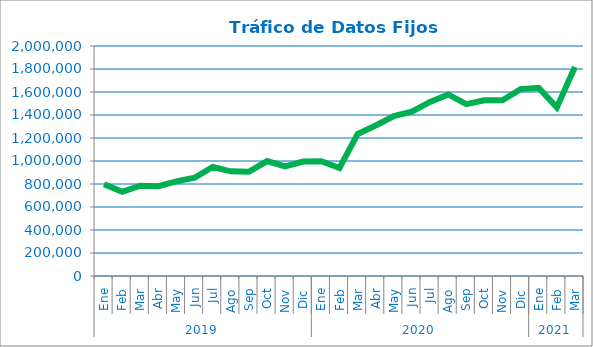
| Category | Series 2 |
|---|---|
| 0 | 798685.918 |
| 1 | 731575.817 |
| 2 | 784749.128 |
| 3 | 780968.133 |
| 4 | 823287.283 |
| 5 | 854090.708 |
| 6 | 947593.778 |
| 7 | 909855.298 |
| 8 | 906240.596 |
| 9 | 999396.547 |
| 10 | 952644.18 |
| 11 | 994702.802 |
| 12 | 998043.119 |
| 13 | 939529.747 |
| 14 | 1233422.945 |
| 15 | 1308700.517 |
| 16 | 1390818.383 |
| 17 | 1429389.058 |
| 18 | 1513898.129 |
| 19 | 1578469.308 |
| 20 | 1494651.805 |
| 21 | 1527689.762 |
| 22 | 1527595.376 |
| 23 | 1624013.076 |
| 24 | 1635978.542 |
| 25 | 1466373.79 |
| 26 | 1817279.963 |